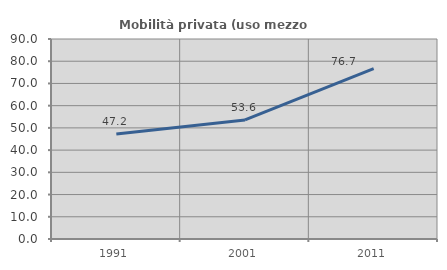
| Category | Mobilità privata (uso mezzo privato) |
|---|---|
| 1991.0 | 47.244 |
| 2001.0 | 53.6 |
| 2011.0 | 76.699 |